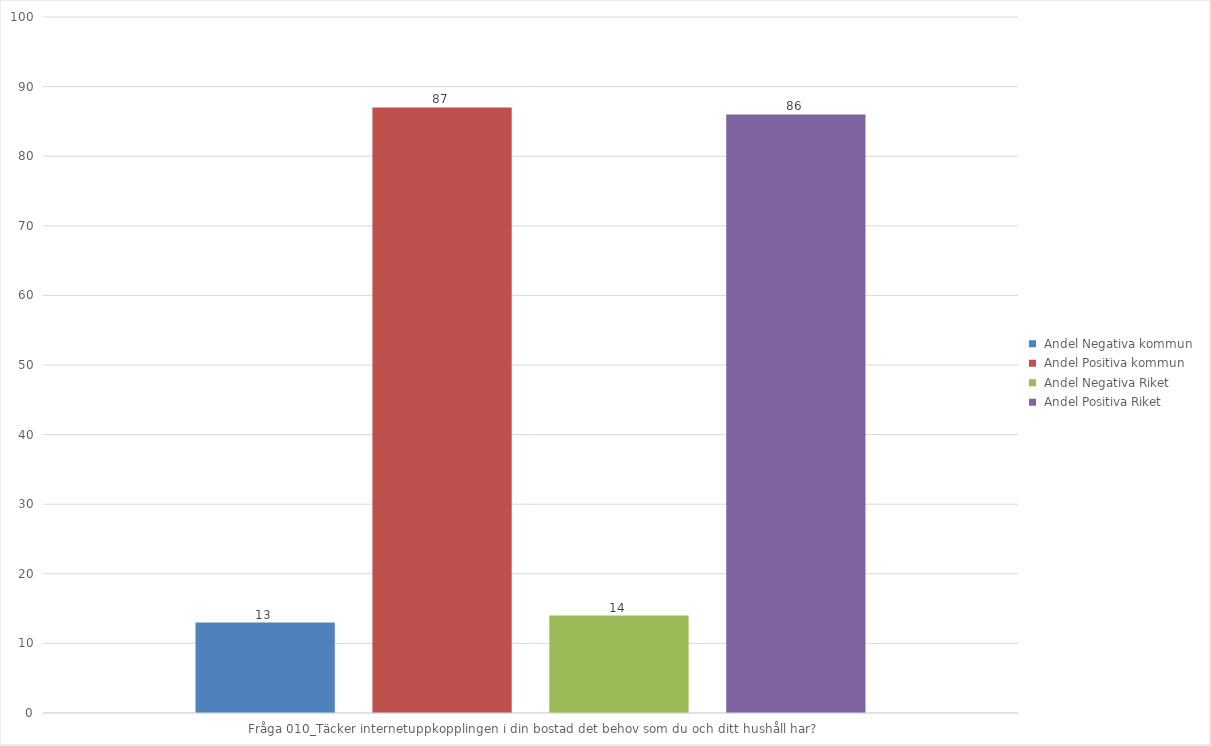
| Category |  Andel Negativa kommun |  Andel Positiva kommun |  Andel Negativa Riket |  Andel Positiva Riket |
|---|---|---|---|---|
| Fråga 010_Täcker internetuppkopplingen i din bostad det behov som du och ditt hushåll har? | 13 | 87 | 14 | 86 |